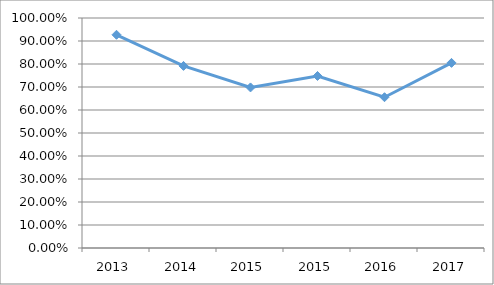
| Category | RMA1-M4O37 |
|---|---|
| 2013.0 | 0.927 |
| 2014.0 | 0.792 |
| 2015.0 | 0.698 |
| 2015.0 | 0.748 |
| 2016.0 | 0.656 |
| 2017.0 | 0.805 |